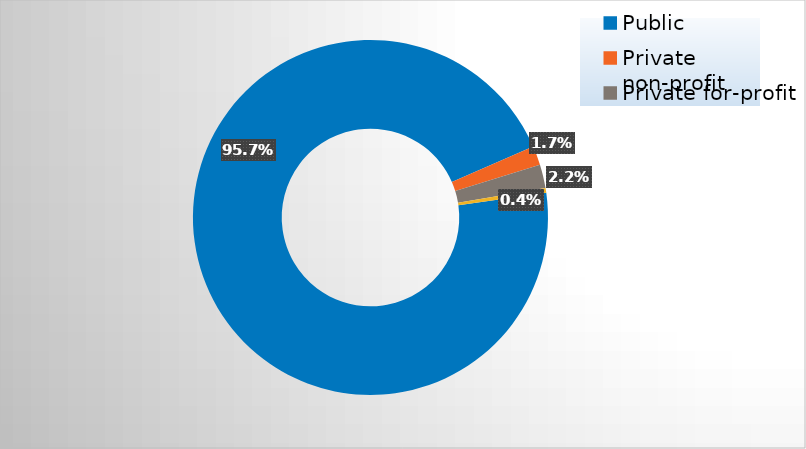
| Category | Series 0 |
|---|---|
| Public | 0.957 |
| Private non-profit | 0.017 |
| Private for-profit | 0.022 |
| Federal | 0.004 |